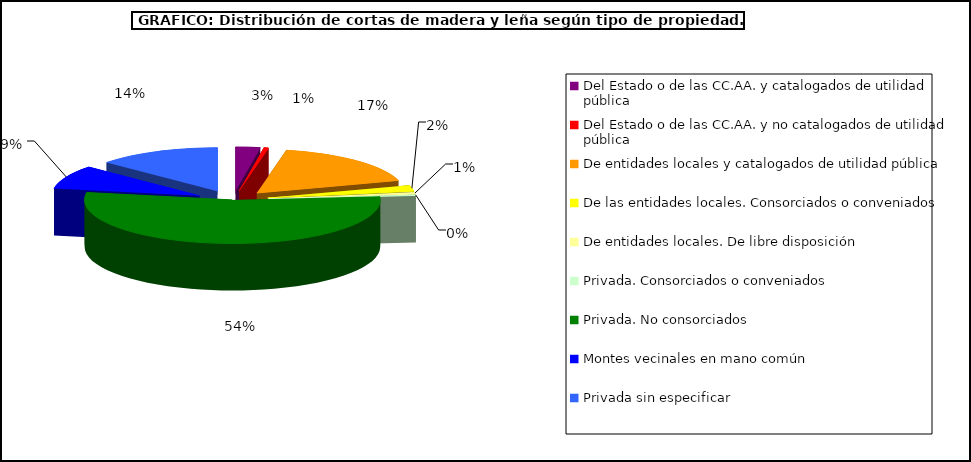
| Category | Series 0 |
|---|---|
| Del Estado o de las CC.AA. y catalogados de utilidad pública | 401814.675 |
| Del Estado o de las CC.AA. y no catalogados de utilidad pública | 77302.25 |
| De entidades locales y catalogados de utilidad pública | 2574104.84 |
| De las entidades locales. Consorciados o conveniados | 331660.355 |
| De entidades locales. De libre disposición | 114990.99 |
| Privada. Consorciados o conveniados | 54991.369 |
| Privada. No consorciados | 8116834.59 |
| Montes vecinales en mano común | 1318160 |
| Privada sin especificar | 2027598.76 |